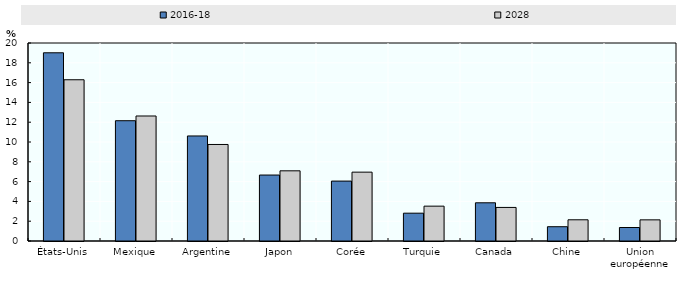
| Category | 2016-18 | 2028 |
|---|---|---|
| États-Unis | 19.011 | 16.287 |
| Mexique | 12.15 | 12.627 |
| Argentine | 10.61 | 9.75 |
| Japon | 6.662 | 7.09 |
| Corée | 6.051 | 6.955 |
| Turquie | 2.81 | 3.52 |
| Canada | 3.859 | 3.391 |
| Chine | 1.443 | 2.143 |
| Union européenne | 1.363 | 2.137 |